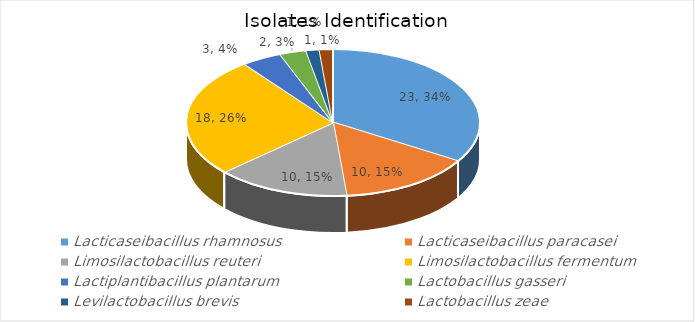
| Category | Series 0 |
|---|---|
| Lacticaseibacillus rhamnosus | 23 |
| Lacticaseibacillus paracasei | 10 |
| Limosilactobacillus reuteri | 10 |
| Limosilactobacillus fermentum | 18 |
| Lactiplantibacillus plantarum | 3 |
| Lactobacillus gasseri | 2 |
| Levilactobacillus brevis | 1 |
| Lactobacillus zeae | 1 |